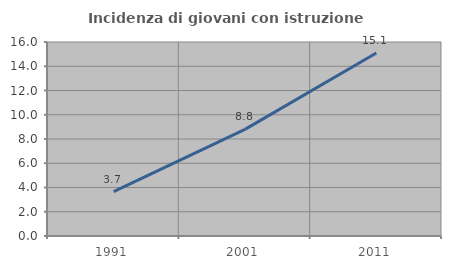
| Category | Incidenza di giovani con istruzione universitaria |
|---|---|
| 1991.0 | 3.666 |
| 2001.0 | 8.796 |
| 2011.0 | 15.096 |